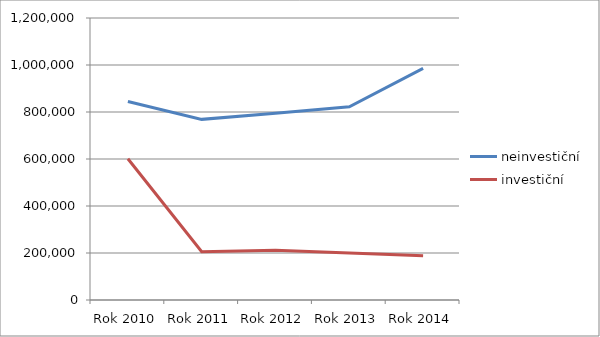
| Category | neinvestiční | investiční |
|---|---|---|
| Rok 2010 | 844545 | 601220 |
| Rok 2011 | 768639 | 205186 |
| Rok 2012 | 794287 | 211395 |
| Rok 2013 | 821860 | 199646 |
| Rok 2014 | 985847 | 187891 |